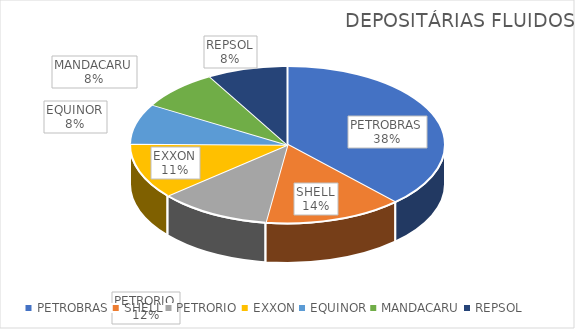
| Category | Series 0 |
|---|---|
| PETROBRAS | 1037 |
| SHELL | 387 |
| PETRORIO | 315 |
| EXXON | 311 |
| EQUINOR | 227 |
| MANDACARU | 225 |
| REPSOL | 225 |